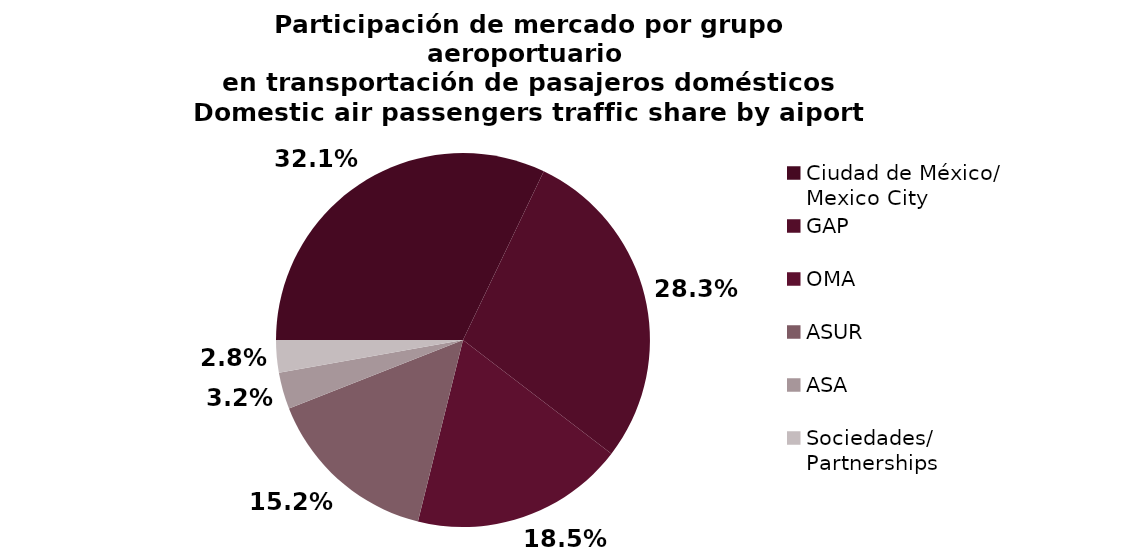
| Category | Series 0 |
|---|---|
| Ciudad de México/
Mexico City | 2295.334 |
| GAP | 2022.105 |
| OMA | 1320.303 |
| ASUR | 1083.453 |
| ASA | 226.52 |
| Sociedades/
Partnerships | 199.94 |